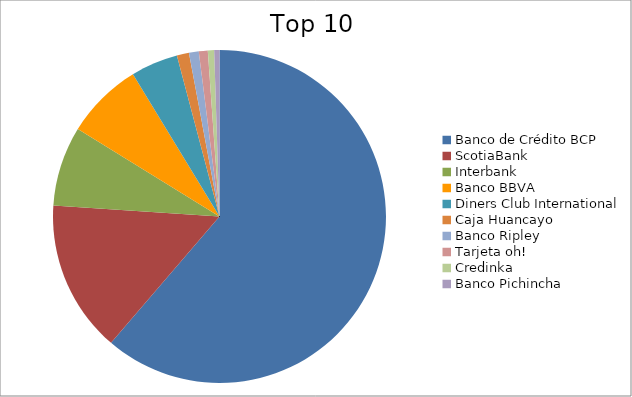
| Category | Series 0 |
|---|---|
| Banco de Crédito BCP | 61.29 |
| ScotiaBank | 14.76 |
| Interbank | 7.75 |
| Banco BBVA | 7.5 |
| Diners Club International | 4.58 |
| Caja Huancayo | 1.18 |
| Banco Ripley | 0.95 |
| Tarjeta oh! | 0.87 |
| Credinka | 0.61 |
| Banco Pichincha | 0.51 |